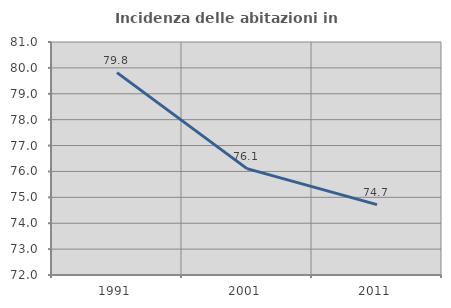
| Category | Incidenza delle abitazioni in proprietà  |
|---|---|
| 1991.0 | 79.817 |
| 2001.0 | 76.109 |
| 2011.0 | 74.72 |